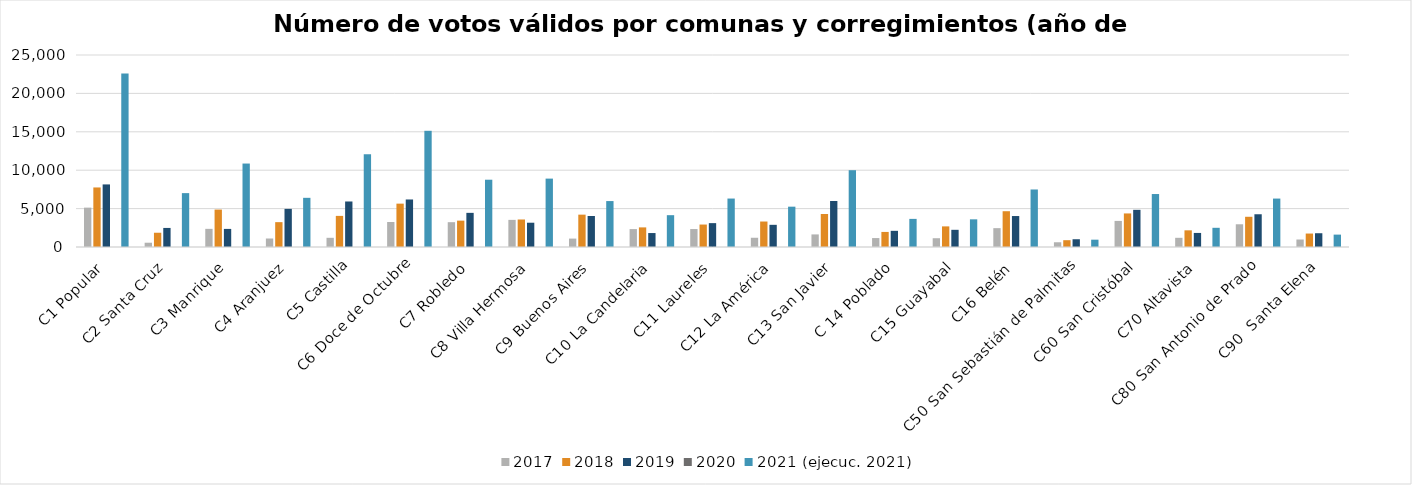
| Category | 2017 | 2018 | 2019 | 2020 | 2021 (ejecuc. 2021) |
|---|---|---|---|---|---|
| C1 Popular | 5126 | 7753 | 8148 |  | 22597 |
| C2 Santa Cruz | 558 | 1857 | 2482 |  | 7015 |
| C3 Manrique | 2363 | 4874 | 2356 |  | 10867 |
| C4 Aranjuez | 1106 | 3236 | 4965 |  | 6403 |
| C5 Castilla | 1196 | 4051 | 5927 |  | 12082 |
| C6 Doce de Octubre | 3253 | 5646 | 6188 |  | 15130 |
| C7 Robledo | 3231 | 3433 | 4446 |  | 8761 |
| C8 Villa Hermosa | 3531 | 3581 | 3162 |  | 8905 |
| C9 Buenos Aires | 1094 | 4212 | 4040 |  | 5981 |
| C10 La Candelaria | 2332 | 2553 | 1817 |  | 4144 |
| C11 Laureles | 2339 | 2924 | 3108 |  | 6309 |
| C12 La América | 1203 | 3318 | 2888 |  | 5251 |
| C13 San Javier | 1639 | 4300 | 5993 |  | 10000 |
| C 14 Poblado | 1164 | 1962 | 2106 |  | 3661 |
| C15 Guayabal | 1143 | 2684 | 2238 |  | 3602 |
| C16 Belén | 2455 | 4659 | 4032 |  | 7489 |
| C50 San Sebastián de Palmitas  | 617 | 886 | 1011 |  | 953 |
| C60 San Cristóbal | 3396 | 4370 | 4840 |  | 6897 |
| C70 Altavista | 1197 | 2171 | 1831 |  | 2500 |
| C80 San Antonio de Prado | 2960 | 3935 | 4264 |  | 6307 |
| C90  Santa Elena | 976 | 1752 | 1793 |  | 1613 |